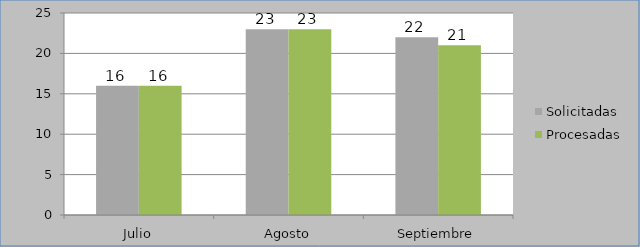
| Category | Solicitadas | Procesadas |
|---|---|---|
| Julio | 16 | 16 |
| Agosto | 23 | 23 |
| Septiembre | 22 | 21 |